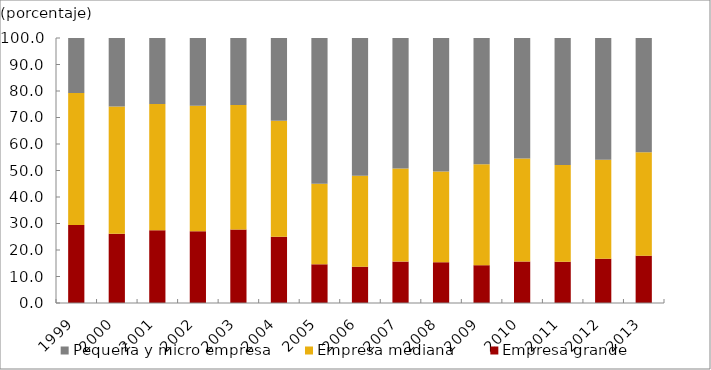
| Category | Empresa grande | Empresa mediana | Pequeña y micro empresa |
|---|---|---|---|
| 1999.0 | 29.4 | 49.851 | 20.748 |
| 2000.0 | 26.111 | 48.028 | 25.861 |
| 2001.0 | 27.427 | 47.682 | 24.891 |
| 2002.0 | 27.122 | 47.356 | 25.521 |
| 2003.0 | 27.768 | 46.939 | 25.293 |
| 2004.0 | 25.047 | 43.751 | 31.202 |
| 2005.0 | 14.609 | 30.348 | 55.044 |
| 2006.0 | 13.699 | 34.324 | 51.977 |
| 2007.0 | 15.634 | 35.106 | 49.259 |
| 2008.0 | 15.386 | 34.21 | 50.404 |
| 2009.0 | 14.268 | 38.105 | 47.627 |
| 2010.0 | 15.66 | 38.834 | 45.506 |
| 2011.0 | 15.579 | 36.506 | 47.915 |
| 2012.0 | 16.708 | 37.303 | 45.989 |
| 2013.0 | 17.855 | 39.025 | 43.12 |